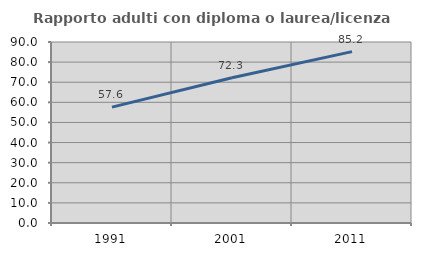
| Category | Rapporto adulti con diploma o laurea/licenza media  |
|---|---|
| 1991.0 | 57.637 |
| 2001.0 | 72.25 |
| 2011.0 | 85.204 |